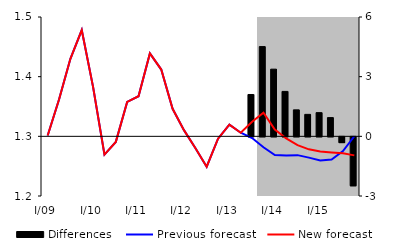
| Category | Differences |
|---|---|
| 0 | 0 |
| 1 | 0 |
| 2 | 0 |
| 3 | 0 |
| 4 | 0 |
| 5 | 0 |
| 6 | 0 |
| 7 | 0 |
| 8 | 0 |
| 9 | 0 |
| 10 | 0 |
| 11 | 0 |
| 12 | 0 |
| 13 | 0 |
| 14 | 0 |
| 15 | 0 |
| 16 | 0 |
| 17 | 0 |
| 18 | 2.104 |
| 19 | 4.514 |
| 20 | 3.377 |
| 21 | 2.259 |
| 22 | 1.332 |
| 23 | 1.104 |
| 24 | 1.191 |
| 25 | 0.943 |
| 26 | -0.291 |
| 27 | -2.462 |